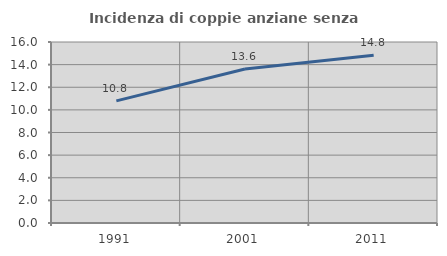
| Category | Incidenza di coppie anziane senza figli  |
|---|---|
| 1991.0 | 10.798 |
| 2001.0 | 13.616 |
| 2011.0 | 14.833 |